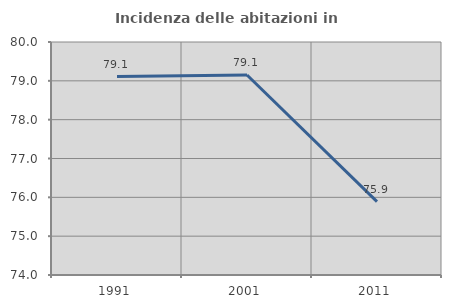
| Category | Incidenza delle abitazioni in proprietà  |
|---|---|
| 1991.0 | 79.11 |
| 2001.0 | 79.15 |
| 2011.0 | 75.891 |